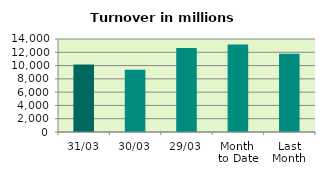
| Category | Series 0 |
|---|---|
| 31/03 | 10148.849 |
| 30/03 | 9358.922 |
| 29/03 | 12660.535 |
| Month 
to Date | 13160.868 |
| Last
Month | 11787.675 |